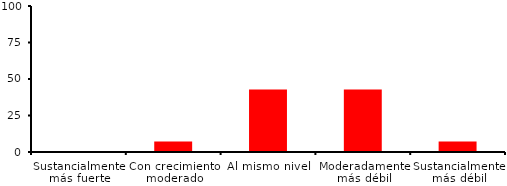
| Category | Series 0 |
|---|---|
| Sustancialmente más fuerte | 0 |
| Con crecimiento moderado | 7.143 |
| Al mismo nivel | 42.857 |
| Moderadamente más débil | 42.857 |
| Sustancialmente más débil | 7.143 |